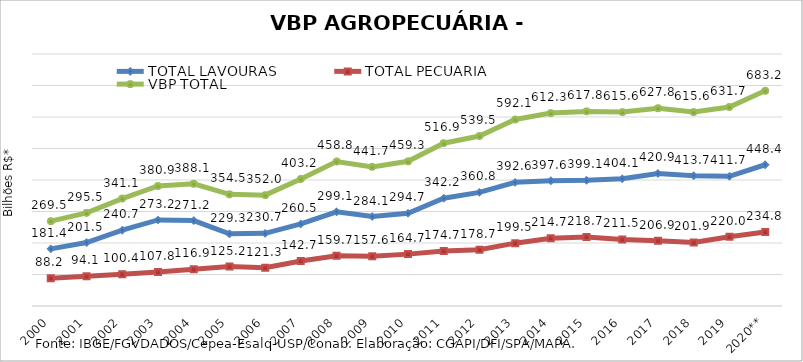
| Category | TOTAL LAVOURAS | TOTAL PECUÁRIA | VBP TOTAL |
|---|---|---|---|
| 2000 | 181.382 | 88.168 | 269.55 |
| 2001 | 201.482 | 94.064 | 295.546 |
| 2002 | 240.677 | 100.414 | 341.091 |
| 2003 | 273.166 | 107.777 | 380.943 |
| 2004 | 271.166 | 116.907 | 388.073 |
| 2005 | 229.259 | 125.236 | 354.495 |
| 2006 | 230.659 | 121.292 | 351.952 |
| 2007 | 260.488 | 142.694 | 403.181 |
| 2008 | 299.104 | 159.708 | 458.812 |
| 2009 | 284.109 | 157.631 | 441.74 |
| 2010 | 294.653 | 164.694 | 459.347 |
| 2011 | 342.203 | 174.698 | 516.901 |
| 2012 | 360.812 | 178.706 | 539.517 |
| 2013 | 392.565 | 199.503 | 592.068 |
| 2014 | 397.616 | 214.722 | 612.338 |
| 2015 | 399.059 | 218.743 | 617.802 |
| 2016 | 404.105 | 211.47 | 615.575 |
| 2017 | 420.895 | 206.926 | 627.821 |
| 2018 | 413.699 | 201.922 | 615.621 |
| 2019 | 411.717 | 219.997 | 631.714 |
| 2020** | 448.414 | 234.789 | 683.203 |